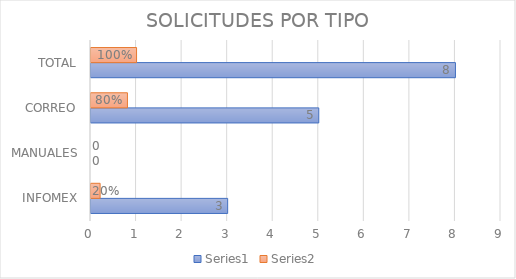
| Category | Series 0 | Series 1 |
|---|---|---|
| INFOMEX | 3 | 0.2 |
| MANUALES | 0 | 0 |
| CORREO | 5 | 0.8 |
| TOTAL | 8 | 1 |